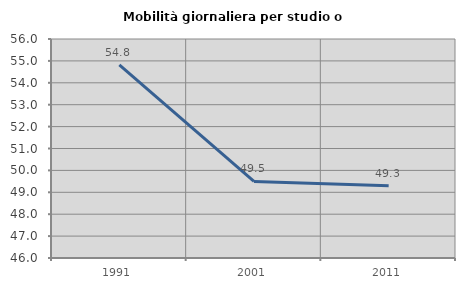
| Category | Mobilità giornaliera per studio o lavoro |
|---|---|
| 1991.0 | 54.82 |
| 2001.0 | 49.498 |
| 2011.0 | 49.297 |